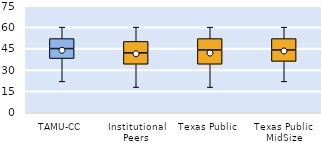
| Category | 25th | 50th | 75th |
|---|---|---|---|
| TAMU-CC | 38 | 7 | 7 |
| Institutional Peers | 34 | 8 | 8 |
| Texas Public | 34 | 10 | 8 |
| Texas Public MidSize | 36 | 8 | 8 |